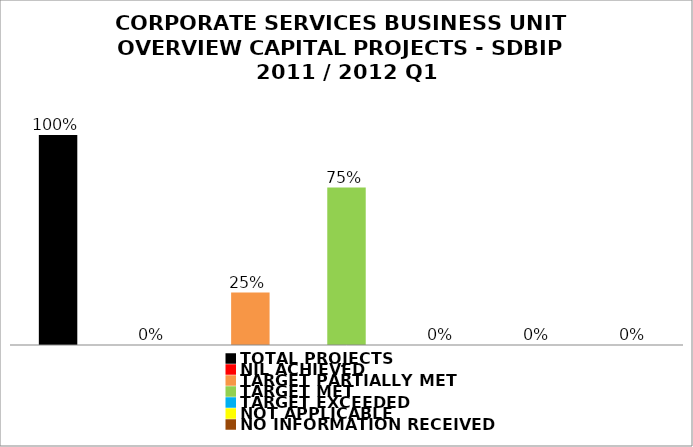
| Category | Series 1 |
|---|---|
| TOTAL PROJECTS | 1 |
| NIL ACHIEVED | 0 |
| TARGET PARTIALLY MET | 0.25 |
| TARGET MET | 0.75 |
| TARGET EXCEEDED | 0 |
| NOT APPLICABLE | 0 |
| NO INFORMATION RECEIVED | 0 |